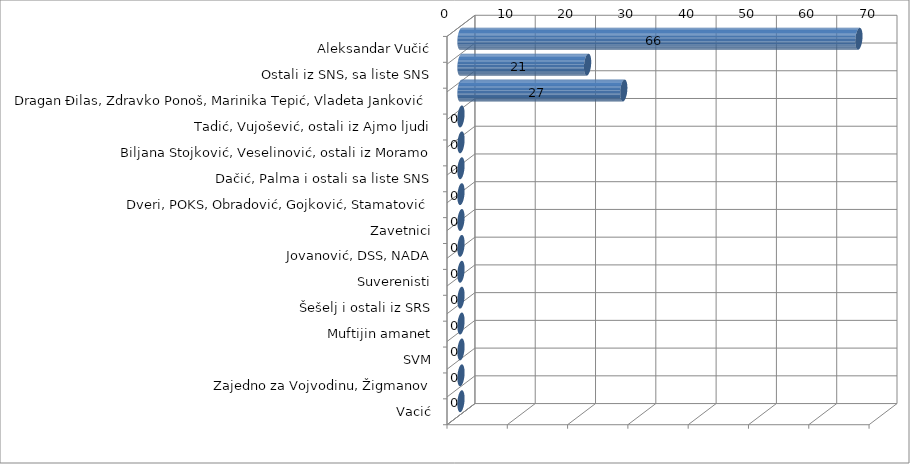
| Category | Series 0 |
|---|---|
| Aleksandar Vučić | 66 |
| Ostali iz SNS, sa liste SNS | 21 |
| Dragan Đilas, Zdravko Ponoš, Marinika Tepić, Vladeta Janković | 27 |
| Tadić, Vujošević, ostali iz Ajmo ljudi | 0 |
| Biljana Stojković, Veselinović, ostali iz Moramo | 0 |
| Dačić, Palma i ostali sa liste SNS | 0 |
| Dveri, POKS, Obradović, Gojković, Stamatović | 0 |
| Zavetnici | 0 |
| Jovanović, DSS, NADA | 0 |
| Suverenisti | 0 |
| Šešelj i ostali iz SRS | 0 |
| Muftijin amanet | 0 |
| SVM | 0 |
| Zajedno za Vojvodinu, Žigmanov | 0 |
| Vacić | 0 |